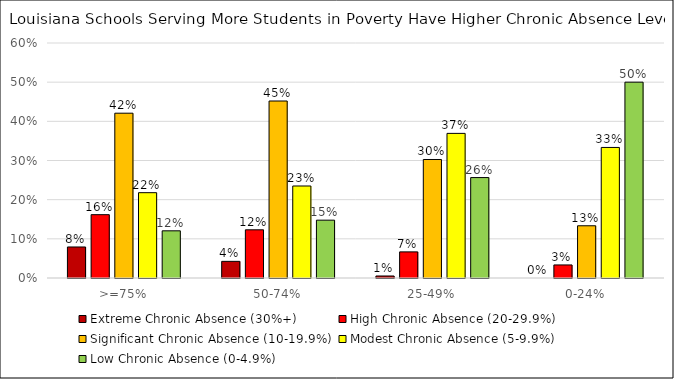
| Category | Extreme Chronic Absence (30%+) | High Chronic Absence (20-29.9%) | Significant Chronic Absence (10-19.9%) | Modest Chronic Absence (5-9.9%) | Low Chronic Absence (0-4.9%) |
|---|---|---|---|---|---|
| >=75% | 0.079 | 0.162 | 0.421 | 0.218 | 0.12 |
| 50-74% | 0.043 | 0.123 | 0.452 | 0.235 | 0.148 |
| 25-49% | 0.005 | 0.067 | 0.303 | 0.369 | 0.256 |
| 0-24% | 0 | 0.033 | 0.133 | 0.333 | 0.5 |